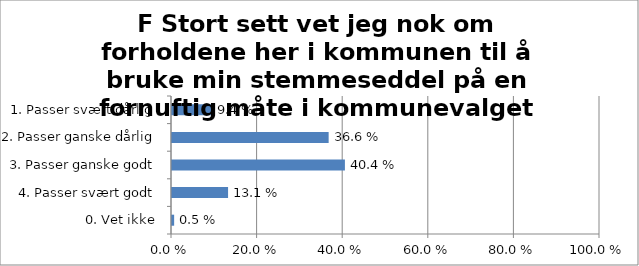
| Category | F Stort sett vet jeg nok om forholdene her i kommunen til å bruke min stemmeseddel på en fornuftig måte i kommunevalget |
|---|---|
| 1. Passer svært dårlig | 0.094 |
| 2. Passer ganske dårlig | 0.366 |
| 3. Passer ganske godt | 0.404 |
| 4. Passer svært godt | 0.131 |
| 0. Vet ikke | 0.005 |